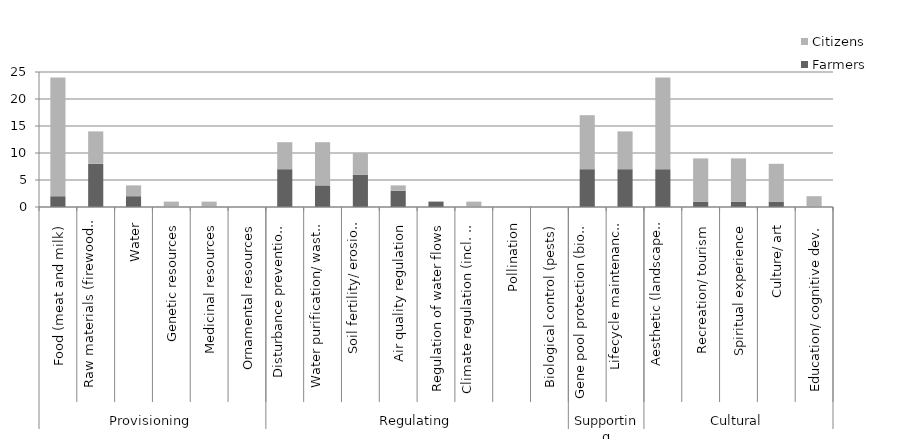
| Category | Farmers | Citizens |
|---|---|---|
| 0 | 2 | 22 |
| 1 | 8 | 6 |
| 2 | 2 | 2 |
| 3 | 0 | 1 |
| 4 | 0 | 1 |
| 5 | 0 | 0 |
| 6 | 7 | 5 |
| 7 | 4 | 8 |
| 8 | 6 | 4 |
| 9 | 3 | 1 |
| 10 | 1 | 0 |
| 11 | 0 | 1 |
| 12 | 0 | 0 |
| 13 | 0 | 0 |
| 14 | 7 | 10 |
| 15 | 7 | 7 |
| 16 | 7 | 17 |
| 17 | 1 | 8 |
| 18 | 1 | 8 |
| 19 | 1 | 7 |
| 20 | 0 | 2 |